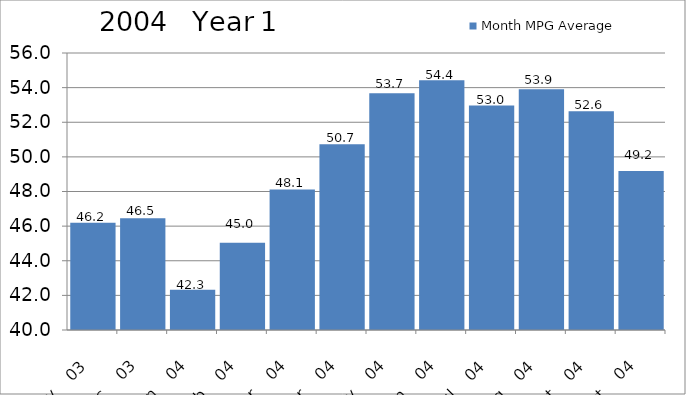
| Category | Month MPG Average |
|---|---|
| 2003-11-01 | 46.197 |
| 2003-12-01 | 46.45 |
| 2004-01-01 | 42.324 |
| 2004-02-01 | 45.045 |
| 2004-03-01 | 48.121 |
| 2004-04-01 | 50.725 |
| 2004-05-01 | 53.682 |
| 2004-06-01 | 54.42 |
| 2004-07-01 | 52.973 |
| 2004-08-01 | 53.9 |
| 2004-09-01 | 52.628 |
| 2004-10-01 | 49.189 |